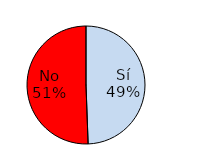
| Category | Series 1 |
|---|---|
| Sí | 86 |
| No | 88 |